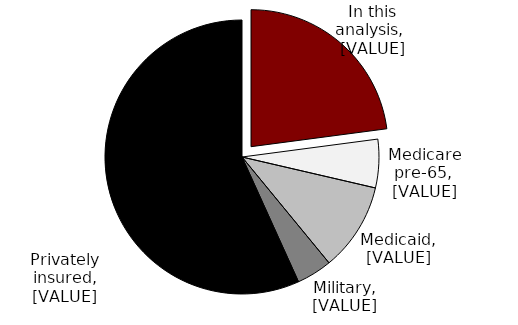
| Category | Series 0 |
|---|---|
| In the analysis | 0.229 |
| Medicare pre-65 | 0.057 |
| Medicaid | 0.104 |
| Military | 0.042 |
| Privately insured | 0.568 |